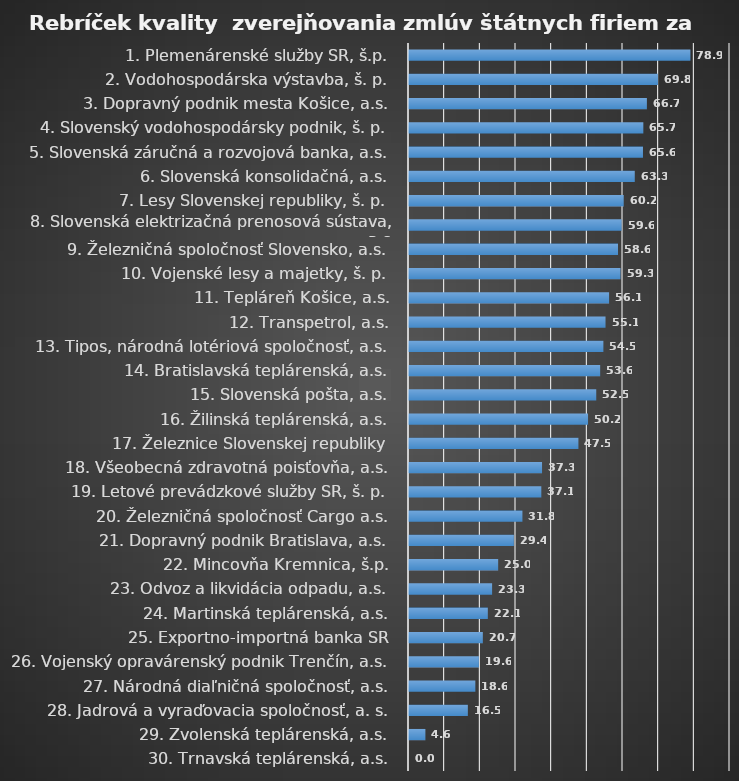
| Category | Series 0 |
|---|---|
| 30. Trnavská teplárenská, a.s. | 0 |
| 29. Zvolenská teplárenská, a.s. | 4.6 |
| 28. Jadrová a vyraďovacia spoločnosť, a. s. | 16.5 |
| 27. Národná diaľničná spoločnosť, a.s. | 18.6 |
| 26. Vojenský opravárenský podnik Trenčín, a.s. | 19.6 |
| 25. Exportno-importná banka SR | 20.7 |
| 24. Martinská teplárenská, a.s. | 22.1 |
| 23. Odvoz a likvidácia odpadu, a.s. | 23.3 |
| 22. Mincovňa Kremnica, š.p. | 25 |
| 21. Dopravný podnik Bratislava, a.s. | 29.4 |
| 20. Železničná spoločnosť Cargo a.s. | 31.8 |
| 19. Letové prevádzkové služby SR, š. p. | 37.1 |
| 18. Všeobecná zdravotná poisťovňa, a.s. | 37.3 |
| 17. Železnice Slovenskej republiky | 47.5 |
| 16. Žilinská teplárenská, a.s. | 50.2 |
| 15. Slovenská pošta, a.s. | 52.5 |
| 14. Bratislavská teplárenská, a.s. | 53.6 |
| 13. Tipos, národná lotériová spoločnosť, a.s. | 54.5 |
| 12. Transpetrol, a.s. | 55.1 |
| 11. Tepláreň Košice, a.s. | 56.1 |
| 10. Vojenské lesy a majetky, š. p. | 59.3 |
| 9. Železničná spoločnosť Slovensko, a.s. | 58.6 |
| 8. Slovenská elektrizačná prenosová sústava, a.s. | 59.6 |
| 7. Lesy Slovenskej republiky, š. p. | 60.2 |
| 6. Slovenská konsolidačná, a.s. | 63.3 |
| 5. Slovenská záručná a rozvojová banka, a.s. | 65.6 |
| 4. Slovenský vodohospodársky podnik, š. p. | 65.7 |
| 3. Dopravný podnik mesta Košice, a.s. | 66.7 |
| 2. Vodohospodárska výstavba, š. p. | 69.8 |
| 1. Plemenárenské služby SR, š.p. | 78.9 |